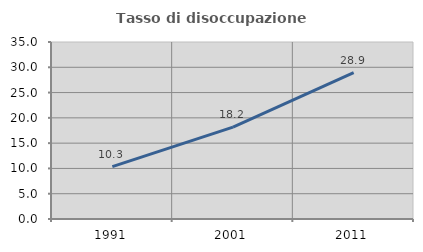
| Category | Tasso di disoccupazione giovanile  |
|---|---|
| 1991.0 | 10.345 |
| 2001.0 | 18.182 |
| 2011.0 | 28.947 |